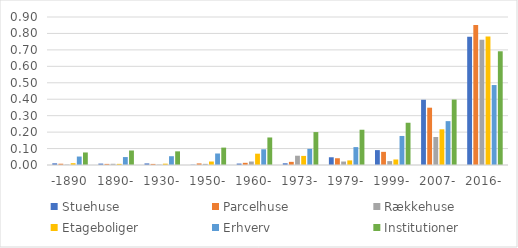
| Category | Stuehuse | Parcelhuse | Rækkehuse | Etageboliger | Erhverv | Institutioner |
|---|---|---|---|---|---|---|
| -1890 | 0.01 | 0.008 | 0.003 | 0.011 | 0.051 | 0.076 |
| 1890- | 0.009 | 0.007 | 0.007 | 0.007 | 0.048 | 0.088 |
| 1930- | 0.01 | 0.007 | 0.002 | 0.008 | 0.053 | 0.083 |
| 1950- | 0.002 | 0.01 | 0.007 | 0.021 | 0.07 | 0.106 |
| 1960- | 0.009 | 0.013 | 0.021 | 0.069 | 0.096 | 0.167 |
| 1973- | 0.01 | 0.019 | 0.056 | 0.055 | 0.098 | 0.2 |
| 1979- | 0.047 | 0.041 | 0.021 | 0.028 | 0.109 | 0.214 |
| 1999- | 0.091 | 0.08 | 0.024 | 0.034 | 0.177 | 0.257 |
| 2007- | 0.397 | 0.348 | 0.17 | 0.217 | 0.267 | 0.398 |
| 2016- | 0.78 | 0.851 | 0.762 | 0.781 | 0.486 | 0.692 |